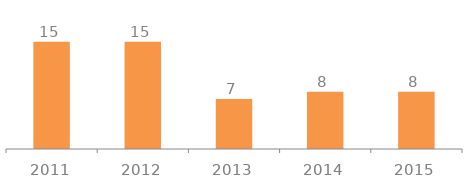
| Category | Profit |
|---|---|
| 2011 | 15 |
| 2012 | 15 |
| 2013 | 7 |
| 2014 | 8 |
| 2015 | 8 |